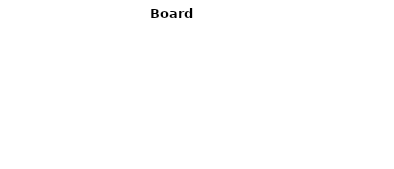
| Category | Series 0 |
|---|---|
| Farmers | 0 |
| Other Vendors | 0 |
| Market Volunteers | 0 |
| Other | 0 |